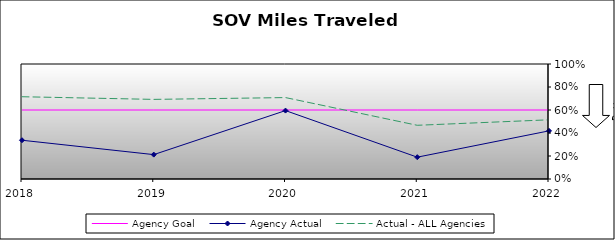
| Category | Agency Goal | Agency Actual | Actual - ALL Agencies |
|---|---|---|---|
| 2018.0 | 0.6 | 0.337 | 0.715 |
| 2019.0 | 0.6 | 0.212 | 0.692 |
| 2020.0 | 0.6 | 0.595 | 0.708 |
| 2021.0 | 0.6 | 0.19 | 0.467 |
| 2022.0 | 0.6 | 0.418 | 0.515 |